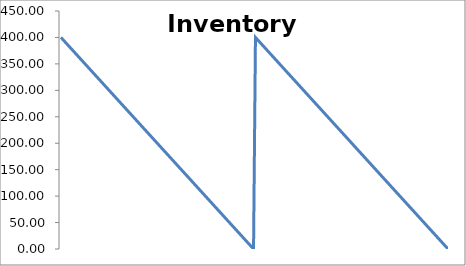
| Category | Series 0 |
|---|---|
| 0 | 400 |
| 1 | 396 |
| 2 | 392 |
| 3 | 388 |
| 4 | 384 |
| 5 | 380 |
| 6 | 376 |
| 7 | 372 |
| 8 | 368 |
| 9 | 364 |
| 10 | 360 |
| 11 | 356 |
| 12 | 352 |
| 13 | 348 |
| 14 | 344 |
| 15 | 340 |
| 16 | 336 |
| 17 | 332 |
| 18 | 328 |
| 19 | 324 |
| 20 | 320 |
| 21 | 316 |
| 22 | 312 |
| 23 | 308 |
| 24 | 304 |
| 25 | 300 |
| 26 | 296 |
| 27 | 292 |
| 28 | 288 |
| 29 | 284 |
| 30 | 280 |
| 31 | 276 |
| 32 | 272 |
| 33 | 268 |
| 34 | 264 |
| 35 | 260 |
| 36 | 256 |
| 37 | 252 |
| 38 | 248 |
| 39 | 244 |
| 40 | 240 |
| 41 | 236 |
| 42 | 232 |
| 43 | 228 |
| 44 | 224 |
| 45 | 220 |
| 46 | 216 |
| 47 | 212 |
| 48 | 208 |
| 49 | 204 |
| 50 | 200 |
| 51 | 196 |
| 52 | 192 |
| 53 | 188 |
| 54 | 184 |
| 55 | 180 |
| 56 | 176 |
| 57 | 172 |
| 58 | 168 |
| 59 | 164 |
| 60 | 160 |
| 61 | 156 |
| 62 | 152 |
| 63 | 148 |
| 64 | 144 |
| 65 | 140 |
| 66 | 136 |
| 67 | 132 |
| 68 | 128 |
| 69 | 124 |
| 70 | 120 |
| 71 | 116 |
| 72 | 112 |
| 73 | 108 |
| 74 | 104 |
| 75 | 100 |
| 76 | 96 |
| 77 | 92 |
| 78 | 88 |
| 79 | 84 |
| 80 | 80 |
| 81 | 76 |
| 82 | 72 |
| 83 | 68 |
| 84 | 64 |
| 85 | 60 |
| 86 | 56 |
| 87 | 52 |
| 88 | 48 |
| 89 | 44 |
| 90 | 40 |
| 91 | 36 |
| 92 | 32 |
| 93 | 28 |
| 94 | 24 |
| 95 | 20 |
| 96 | 16 |
| 97 | 12 |
| 98 | 8 |
| 99 | 4 |
| 100 | 0 |
| 101 | 400 |
| 102 | 396 |
| 103 | 392 |
| 104 | 388 |
| 105 | 384 |
| 106 | 380 |
| 107 | 376 |
| 108 | 372 |
| 109 | 368 |
| 110 | 364 |
| 111 | 360 |
| 112 | 356 |
| 113 | 352 |
| 114 | 348 |
| 115 | 344 |
| 116 | 340 |
| 117 | 336 |
| 118 | 332 |
| 119 | 328 |
| 120 | 324 |
| 121 | 320 |
| 122 | 316 |
| 123 | 312 |
| 124 | 308 |
| 125 | 304 |
| 126 | 300 |
| 127 | 296 |
| 128 | 292 |
| 129 | 288 |
| 130 | 284 |
| 131 | 280 |
| 132 | 276 |
| 133 | 272 |
| 134 | 268 |
| 135 | 264 |
| 136 | 260 |
| 137 | 256 |
| 138 | 252 |
| 139 | 248 |
| 140 | 244 |
| 141 | 240 |
| 142 | 236 |
| 143 | 232 |
| 144 | 228 |
| 145 | 224 |
| 146 | 220 |
| 147 | 216 |
| 148 | 212 |
| 149 | 208 |
| 150 | 204 |
| 151 | 200 |
| 152 | 196 |
| 153 | 192 |
| 154 | 188 |
| 155 | 184 |
| 156 | 180 |
| 157 | 176 |
| 158 | 172 |
| 159 | 168 |
| 160 | 164 |
| 161 | 160 |
| 162 | 156 |
| 163 | 152 |
| 164 | 148 |
| 165 | 144 |
| 166 | 140 |
| 167 | 136 |
| 168 | 132 |
| 169 | 128 |
| 170 | 124 |
| 171 | 120 |
| 172 | 116 |
| 173 | 112 |
| 174 | 108 |
| 175 | 104 |
| 176 | 100 |
| 177 | 96 |
| 178 | 92 |
| 179 | 88 |
| 180 | 84 |
| 181 | 80 |
| 182 | 76 |
| 183 | 72 |
| 184 | 68 |
| 185 | 64 |
| 186 | 60 |
| 187 | 56 |
| 188 | 52 |
| 189 | 48 |
| 190 | 44 |
| 191 | 40 |
| 192 | 36 |
| 193 | 32 |
| 194 | 28 |
| 195 | 24 |
| 196 | 20 |
| 197 | 16 |
| 198 | 12 |
| 199 | 8 |
| 200 | 4 |
| 201 | 0 |